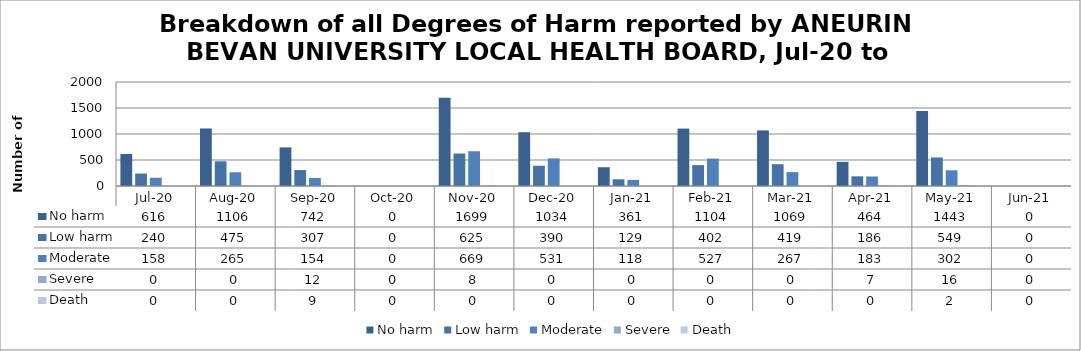
| Category | No harm | Low harm | Moderate | Severe | Death |
|---|---|---|---|---|---|
| Jul-20 | 616 | 240 | 158 | 0 | 0 |
| Aug-20 | 1106 | 475 | 265 | 0 | 0 |
| Sep-20 | 742 | 307 | 154 | 12 | 9 |
| Oct-20 | 0 | 0 | 0 | 0 | 0 |
| Nov-20 | 1699 | 625 | 669 | 8 | 0 |
| Dec-20 | 1034 | 390 | 531 | 0 | 0 |
| Jan-21 | 361 | 129 | 118 | 0 | 0 |
| Feb-21 | 1104 | 402 | 527 | 0 | 0 |
| Mar-21 | 1069 | 419 | 267 | 0 | 0 |
| Apr-21 | 464 | 186 | 183 | 7 | 0 |
| May-21 | 1443 | 549 | 302 | 16 | 2 |
| Jun-21 | 0 | 0 | 0 | 0 | 0 |